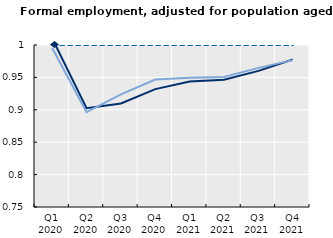
| Category | Formal employment | Women | Formal employment | Men | Reference quarters (2019) |
|---|---|---|---|
| Q1 2020 | 1.01 | 0.995 | 1 |
| Q2 2020 | 0.902 | 0.896 | 1 |
| Q3 2020 | 0.91 | 0.924 | 1 |
| Q4 2020 | 0.932 | 0.947 | 1 |
| Q1 2021 | 0.944 | 0.95 | 1 |
| Q2 2021 | 0.946 | 0.951 | 1 |
| Q3 2021 | 0.96 | 0.965 | 1 |
| Q4 2021 | 0.978 | 0.977 | 1 |